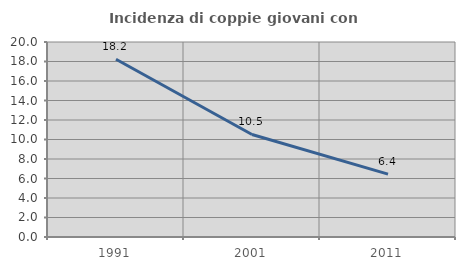
| Category | Incidenza di coppie giovani con figli |
|---|---|
| 1991.0 | 18.228 |
| 2001.0 | 10.513 |
| 2011.0 | 6.445 |